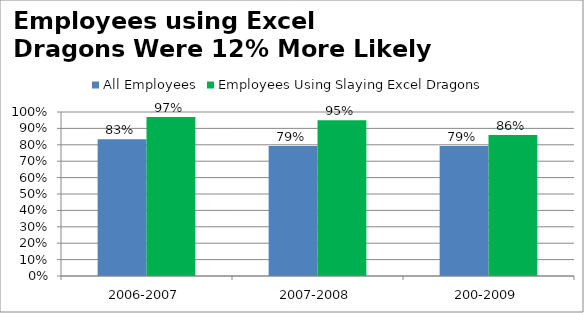
| Category | All Employees | Employees Using Slaying Excel Dragons |
|---|---|---|
| 2006-2007 | 0.834 | 0.97 |
| 2007-2008 | 0.792 | 0.95 |
| 200-2009 | 0.793 | 0.86 |